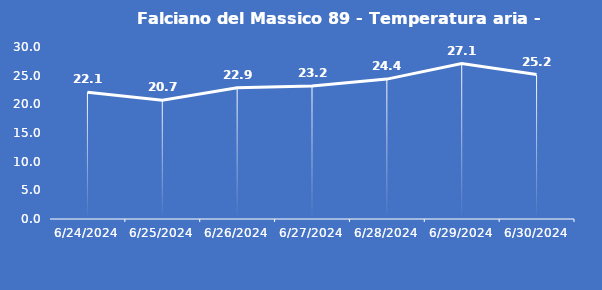
| Category | Falciano del Massico 89 - Temperatura aria - Grezzo (°C) |
|---|---|
| 6/24/24 | 22.1 |
| 6/25/24 | 20.7 |
| 6/26/24 | 22.9 |
| 6/27/24 | 23.2 |
| 6/28/24 | 24.4 |
| 6/29/24 | 27.1 |
| 6/30/24 | 25.2 |